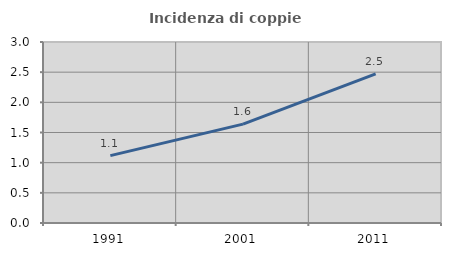
| Category | Incidenza di coppie miste |
|---|---|
| 1991.0 | 1.117 |
| 2001.0 | 1.639 |
| 2011.0 | 2.473 |